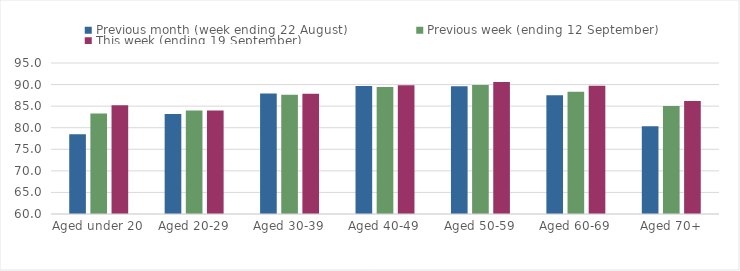
| Category | Previous month (week ending 22 August) | Previous week (ending 12 September) | This week (ending 19 September) |
|---|---|---|---|
| Aged under 20 | 78.5 | 83.29 | 85.23 |
| Aged 20-29 | 83.19 | 83.99 | 84.01 |
| Aged 30-39 | 87.92 | 87.63 | 87.87 |
| Aged 40-49 | 89.67 | 89.41 | 89.82 |
| Aged 50-59 | 89.6 | 89.92 | 90.57 |
| Aged 60-69 | 87.52 | 88.31 | 89.73 |
| Aged 70+ | 80.35 | 85.01 | 86.19 |